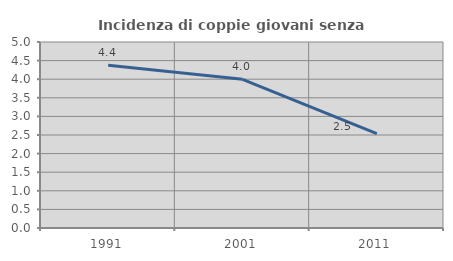
| Category | Incidenza di coppie giovani senza figli |
|---|---|
| 1991.0 | 4.373 |
| 2001.0 | 3.996 |
| 2011.0 | 2.537 |